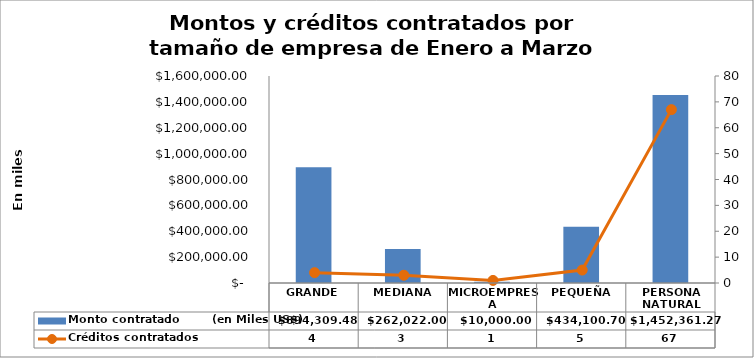
| Category | Monto contratado        (en Miles US$) |
|---|---|
| GRANDE | 894309.48 |
| MEDIANA | 262022 |
| MICROEMPRESA | 10000 |
| PEQUEÑA | 434100.7 |
| PERSONA NATURAL | 1452361.27 |